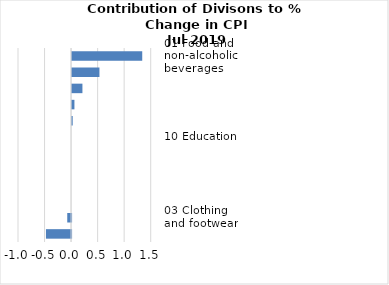
| Category |     Contributions |
|---|---|
| 01 Food and non-alcoholic beverages | 1.322 |
| 04 Housing, water, electricity, gas and other fuels | 0.516 |
| 02 Alcoholic beverages, tobacco and narcotics | 0.195 |
| 05 Furnishings, household equipment and routine household maintenance | 0.044 |
| 12 Miscellaneous goods and services | 0.012 |
| 10 Education | 0 |
| 11 Restaurants and hotels | 0 |
| 06 Health | 0 |
| 08 Communication | 0 |
| 09 Recreation and culture | 0 |
| 03 Clothing and footwear | -0.072 |
| 07 Transport | -0.474 |